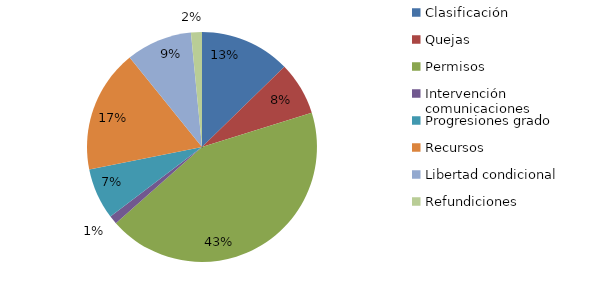
| Category | Series 0 |
|---|---|
| Clasificación | 182 |
| Quejas | 107 |
| Permisos | 620 |
| Intervención comunicaciones | 17 |
| Progresiones grado | 103 |
| Recursos | 248 |
| Libertad condicional | 133 |
| Sanciones | 0 |
| Refundiciones | 22 |
| Competencia | 0 |